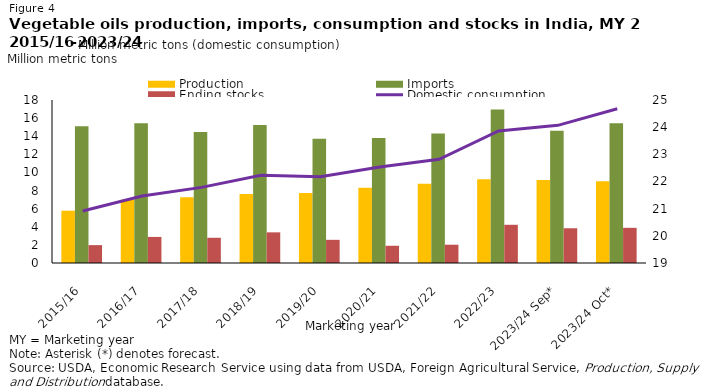
| Category | Production | Imports | Ending stocks |
|---|---|---|---|
| 2015/16 | 5.776 | 15.107 | 1.973 |
| 2016/17 | 6.988 | 15.425 | 2.879 |
| 2017/18 | 7.265 | 14.466 | 2.786 |
| 2018/19 | 7.614 | 15.25 | 3.385 |
| 2019/20 | 7.718 | 13.732 | 2.559 |
| 2020/21 | 8.319 | 13.81 | 1.903 |
| 2021/22 | 8.742 | 14.309 | 2.019 |
| 2022/23 | 9.254 | 16.962 | 4.22 |
| 2023/24 Sep* | 9.171 | 14.613 | 3.836 |
| 2023/24 Oct* | 9.037 | 15.443 | 3.884 |